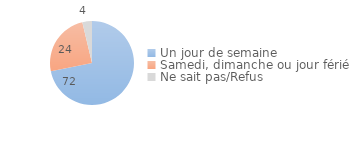
| Category | Series 0 |
|---|---|
| Un jour de semaine | 71.89 |
| Samedi, dimanche ou jour férié | 24.498 |
| Ne sait pas/Refus | 3.702 |